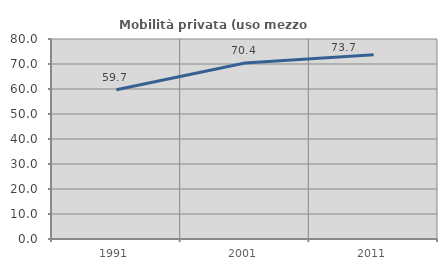
| Category | Mobilità privata (uso mezzo privato) |
|---|---|
| 1991.0 | 59.679 |
| 2001.0 | 70.43 |
| 2011.0 | 73.739 |